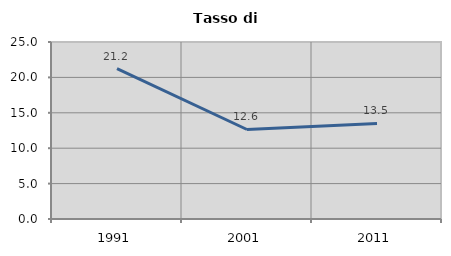
| Category | Tasso di disoccupazione   |
|---|---|
| 1991.0 | 21.239 |
| 2001.0 | 12.642 |
| 2011.0 | 13.489 |